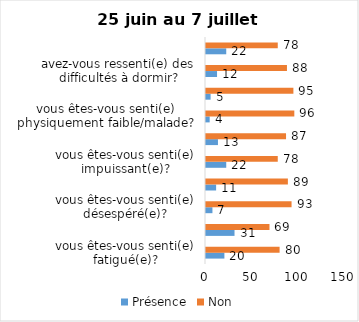
| Category | Présence | Non |
|---|---|---|
| vous êtes-vous senti(e) fatigué(e)? | 20 | 80 |
| vous êtes-vous senti(e) déçu(e) par certaines personnes? | 31 | 69 |
| vous êtes-vous senti(e) désespéré(e)? | 7 | 93 |
| vous êtes-vous senti(e) piégé(e)? | 11 | 89 |
| vous êtes-vous senti(e) impuissant(e)? | 22 | 78 |
| vous êtes-vous senti(e) déprimé(e)? | 13 | 87 |
| vous êtes-vous senti(e) physiquement faible/malade? | 4 | 96 |
| vous êtes-vous senti(e) inutile / “moins que rien”? | 5 | 95 |
| avez-vous ressenti(e) des difficultés à dormir? | 12 | 88 |
| pouvez-vous dire “J’en ai assez” / “Ça suffit”? | 22 | 78 |